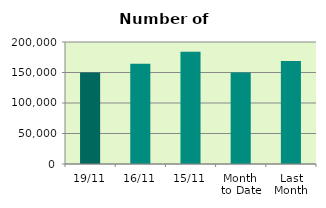
| Category | Series 0 |
|---|---|
| 19/11 | 149808 |
| 16/11 | 164340 |
| 15/11 | 183844 |
| Month 
to Date | 149796.769 |
| Last
Month | 168717.043 |